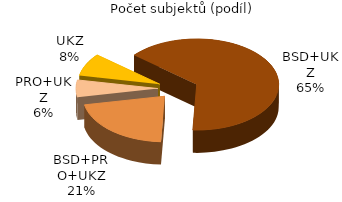
| Category | Series 0 |
|---|---|
| BSD+UKZ | 64 |
| BSD+PRO+UKZ | 21 |
| PRO+UKZ | 6 |
| UKZ | 8 |